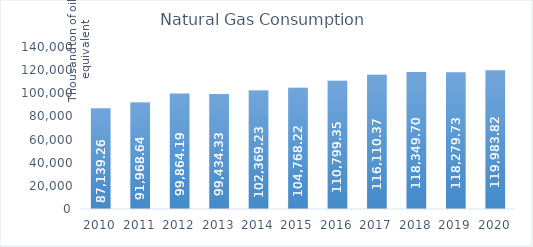
| Category | Natural Gas Consumption |
|---|---|
| 2010.0 | 87139.26 |
| 2011.0 | 91968.64 |
| 2012.0 | 99864.19 |
| 2013.0 | 99434.33 |
| 2014.0 | 102369.23 |
| 2015.0 | 104768.22 |
| 2016.0 | 110799.35 |
| 2017.0 | 116110.37 |
| 2018.0 | 118349.7 |
| 2019.0 | 118279.73 |
| 2020.0 | 119983.82 |